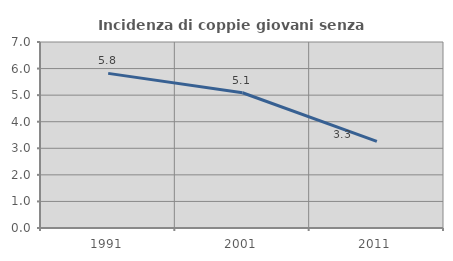
| Category | Incidenza di coppie giovani senza figli |
|---|---|
| 1991.0 | 5.82 |
| 2001.0 | 5.091 |
| 2011.0 | 3.257 |